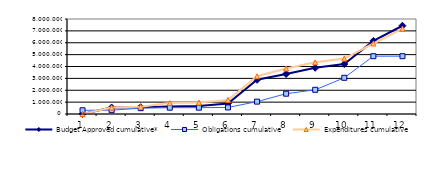
| Category | Budget Approved cumulative* | Obligations cumulative | Expenditures cumulative |
|---|---|---|---|
| 0 | 0 | 312616.897 | 0 |
| 1 | 545013.382 | 322576.965 | 545748.588 |
| 2 | 568684.098 | 490307.946 | 611299.91 |
| 3 | 622362.565 | 534017.247 | 918527.823 |
| 4 | 664030.275 | 534017.247 | 961275.663 |
| 5 | 887754.485 | 551475.21 | 1185491.303 |
| 6 | 2881114.595 | 1043385.2 | 3177698.773 |
| 7 | 3370085.405 | 1710464.22 | 3830581.153 |
| 8 | 3893893.1 | 2039051.509 | 4351278.944 |
| 9 | 4206477.846 | 3048901.456 | 4667984.805 |
| 10 | 6154883.976 | 4868276.831 | 5937548.19 |
| 11 | 7432361.181 | 4868276.831 | 7188972.52 |